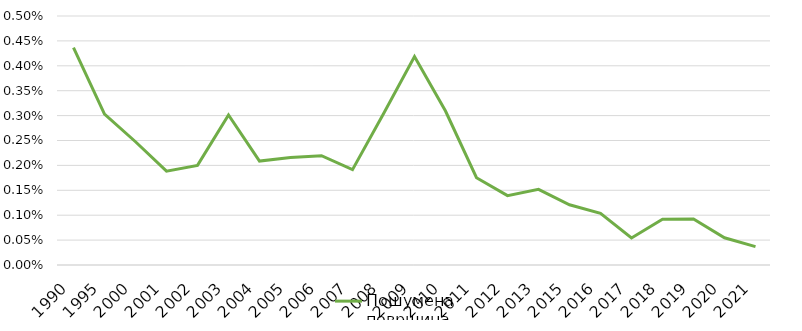
| Category | Пошумена површина |
|---|---|
| 1990.0 | 0.004 |
| 1995.0 | 0.003 |
| 2000.0 | 0.002 |
| 2001.0 | 0.002 |
| 2002.0 | 0.002 |
| 2003.0 | 0.003 |
| 2004.0 | 0.002 |
| 2005.0 | 0.002 |
| 2006.0 | 0.002 |
| 2007.0 | 0.002 |
| 2008.0 | 0.003 |
| 2009.0 | 0.004 |
| 2010.0 | 0.003 |
| 2011.0 | 0.002 |
| 2012.0 | 0.001 |
| 2013.0 | 0.002 |
| 2015.0 | 0.001 |
| 2016.0 | 0.001 |
| 2017.0 | 0.001 |
| 2018.0 | 0.001 |
| 2019.0 | 0.001 |
| 2020.0 | 0.001 |
| 2021.0 | 0 |